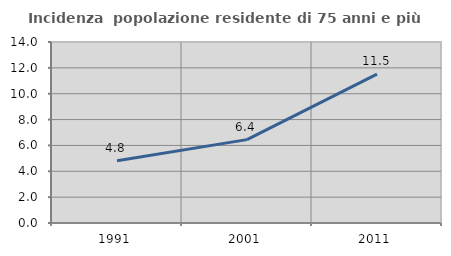
| Category | Incidenza  popolazione residente di 75 anni e più |
|---|---|
| 1991.0 | 4.814 |
| 2001.0 | 6.449 |
| 2011.0 | 11.516 |